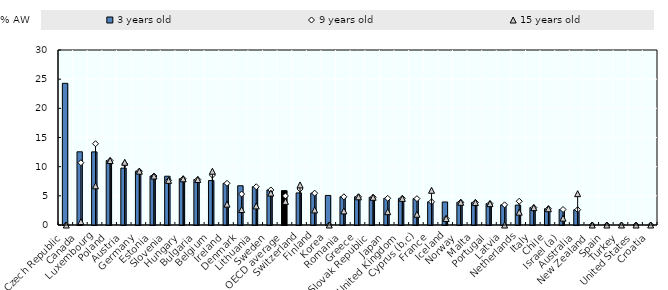
| Category | 3 years old |
|---|---|
| Czech Republic | 24.29 |
| Canada | 12.547 |
| Luxembourg | 12.534 |
| Poland | 11.046 |
| Austria | 9.752 |
| Germany | 9.223 |
| Estonia | 8.392 |
| Slovenia | 8.365 |
| Hungary | 7.918 |
| Bulgaria | 7.797 |
| Belgium | 7.621 |
| Ireland | 7.147 |
| Denmark | 6.731 |
| Lithuania | 6.556 |
| Sweden | 6.006 |
| OECD average | 5.892 |
| Switzerland | 5.498 |
| Finland | 5.458 |
| Korea | 5.068 |
| Romania | 4.835 |
| Greece | 4.829 |
| Slovak Republic | 4.75 |
| Japan | 4.574 |
| United Kingdom | 4.557 |
| Cyprus (b,c) | 4.517 |
| France | 3.967 |
| Iceland | 3.946 |
| Norway | 3.893 |
| Malta | 3.858 |
| Portugal | 3.662 |
| Latvia | 3.455 |
| Netherlands | 3.409 |
| Italy | 2.98 |
| Chile | 2.787 |
| Israel (a) | 2.657 |
| Australia | 2.616 |
| New Zealand | 0 |
| Spain | 0 |
| Turkey | 0 |
| United States | 0 |
| Croatia | 0 |